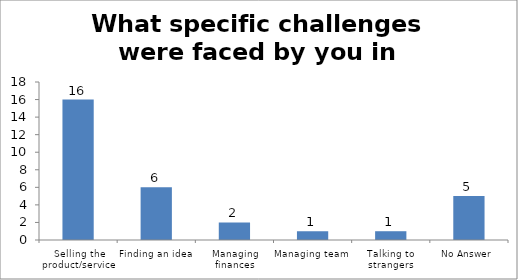
| Category | What specific challenges were faced by you in creating value? |
|---|---|
| Selling the product/service | 16 |
| Finding an idea | 6 |
| Managing finances | 2 |
| Managing team | 1 |
| Talking to strangers | 1 |
| No Answer | 5 |